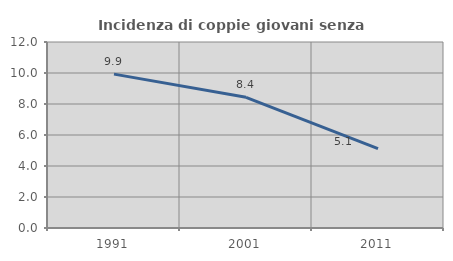
| Category | Incidenza di coppie giovani senza figli |
|---|---|
| 1991.0 | 9.926 |
| 2001.0 | 8.43 |
| 2011.0 | 5.121 |